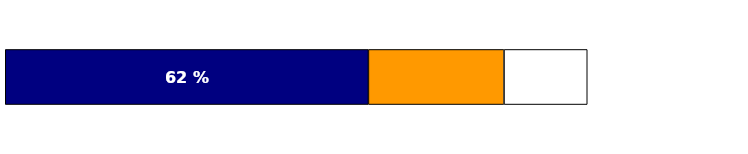
| Category |   | Series 1 | Series 2 |
|---|---|---|---|
| 0 | 62.4 | 23.3 | 14.3 |